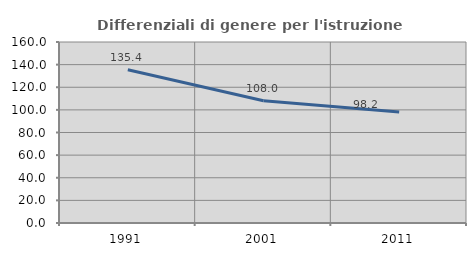
| Category | Differenziali di genere per l'istruzione superiore |
|---|---|
| 1991.0 | 135.397 |
| 2001.0 | 108.037 |
| 2011.0 | 98.199 |